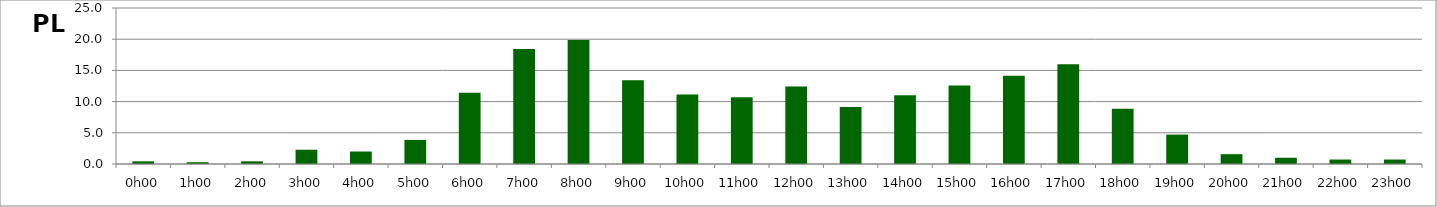
| Category | PL |
|---|---|
| 0.0 | 0.429 |
| 0.041666666666666664 | 0.286 |
| 0.08333333333333333 | 0.429 |
| 0.125 | 2.286 |
| 0.16666666666666666 | 2 |
| 0.20833333333333334 | 3.857 |
| 0.25 | 11.429 |
| 0.2916666666666667 | 18.429 |
| 0.3333333333333333 | 19.857 |
| 0.375 | 13.429 |
| 0.4166666666666667 | 11.143 |
| 0.4583333333333333 | 10.714 |
| 0.5 | 12.429 |
| 0.5416666666666666 | 9.143 |
| 0.5833333333333334 | 11 |
| 0.625 | 12.571 |
| 0.6666666666666666 | 14.143 |
| 0.7083333333333334 | 16 |
| 0.75 | 8.857 |
| 0.7916666666666666 | 4.714 |
| 0.8333333333333334 | 1.571 |
| 0.875 | 1 |
| 0.9166666666666666 | 0.714 |
| 0.9583333333333334 | 0.714 |